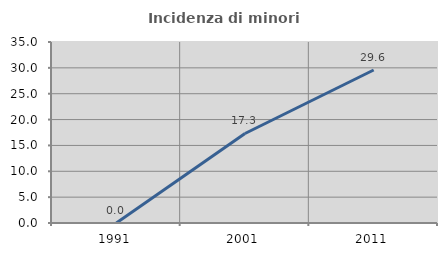
| Category | Incidenza di minori stranieri |
|---|---|
| 1991.0 | 0 |
| 2001.0 | 17.308 |
| 2011.0 | 29.586 |